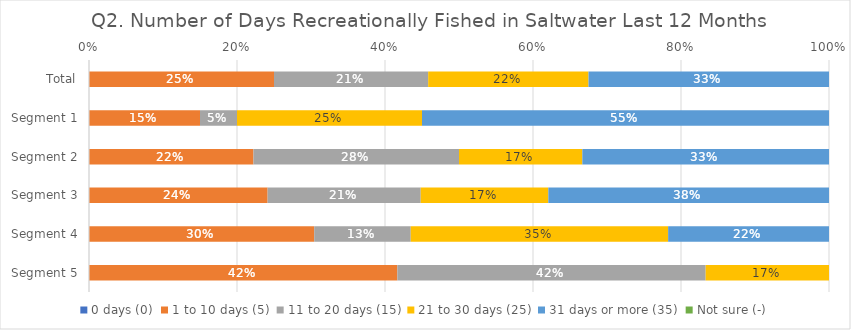
| Category | 0 days (0) | 1 to 10 days (5) | 11 to 20 days (15) | 21 to 30 days (25) | 31 days or more (35) | Not sure (-) |
|---|---|---|---|---|---|---|
| Total | 0 | 0.25 | 0.208 | 0.217 | 0.325 | 0 |
| Segment 1 | 0 | 0.15 | 0.05 | 0.25 | 0.55 | 0 |
| Segment 2 | 0 | 0.222 | 0.278 | 0.167 | 0.333 | 0 |
| Segment 3 | 0 | 0.241 | 0.207 | 0.172 | 0.379 | 0 |
| Segment 4 | 0 | 0.304 | 0.13 | 0.348 | 0.217 | 0 |
| Segment 5 | 0 | 0.417 | 0.417 | 0.167 | 0 | 0 |